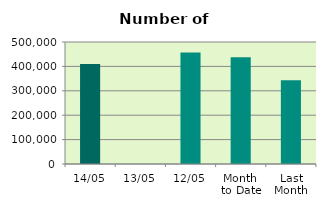
| Category | Series 0 |
|---|---|
| 14/05 | 410208 |
| 13/05 | 0 |
| 12/05 | 456878 |
| Month 
to Date | 437478 |
| Last
Month | 343067.2 |